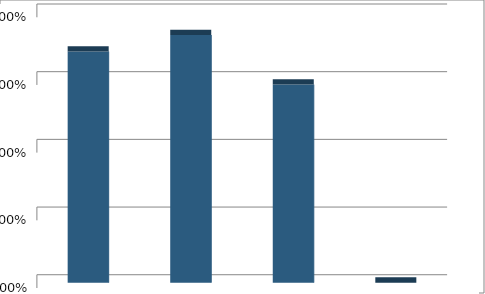
| Category | Series1 |
|---|---|
| Alternative Future #1:  Low Intensity | 0.342 |
| Alternative Future #2:  Medium Intensity | 0.366 |
| Alternative Future #3:  High Intensity | 0.293 |
| None of the Above | 0 |